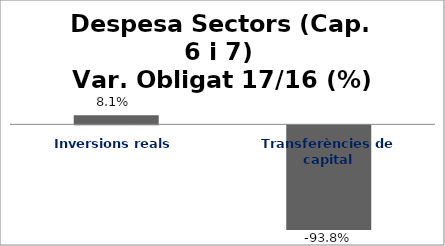
| Category | Series 0 |
|---|---|
| Inversions reals | 0.081 |
| Transferències de capital | -0.938 |